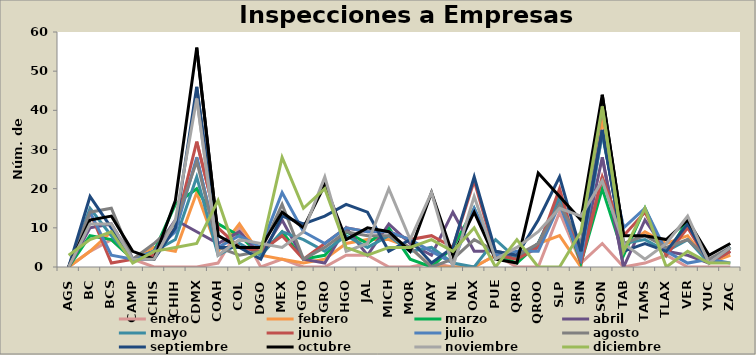
| Category | enero | febrero | marzo | abril | mayo | junio | julio | agosto | septiembre | octubre | noviembre | diciembre |
|---|---|---|---|---|---|---|---|---|---|---|---|---|
| AGS | 0 | 0 | 0 | 0 | 0 | 0 | 0 | 0 | 0 | 0 | 0 | 3 |
| BC | 4 | 4 | 8 | 10 | 15 | 14 | 14 | 14 | 18 | 12 | 11 | 7 |
| BCS | 7 | 9 | 7 | 11 | 8 | 1 | 3 | 15 | 10 | 13 | 11 | 9 |
| CAMP | 2 | 2 | 2 | 2 | 2 | 2 | 2 | 2 | 2 | 4 | 2 | 1 |
| CHIS | 0 | 5 | 4 | 4 | 4 | 3 | 4 | 6 | 2 | 2 | 2 | 4 |
| CHIH | 0 | 4 | 16 | 12 | 7 | 10 | 9 | 11 | 10 | 17 | 12 | 5 |
| CDMX | 0 | 19 | 20 | 9 | 23 | 32 | 28 | 27 | 46 | 56 | 43 | 6 |
| COAH | 1 | 4 | 11 | 6 | 3 | 10 | 5 | 5 | 5 | 8 | 3 | 17 |
| COL | 10 | 11 | 8 | 9 | 6 | 5 | 8 | 3 | 5 | 5 | 7 | 1 |
| DGO | 0 | 3 | 3 | 3 | 3 | 4 | 5 | 4 | 2 | 5 | 6 | 4 |
| MEX | 2 | 2 | 9 | 12 | 9 | 8 | 19 | 16 | 13 | 14 | 5 | 28 |
| GTO | 0 | 1 | 2 | 2 | 7 | 2 | 9 | 2 | 11 | 10 | 9 | 15 |
| GRO | 0 | 2 | 3 | 1 | 4 | 6 | 6 | 5 | 13 | 21 | 23 | 20 |
| HGO | 3 | 6 | 9 | 10 | 8 | 10 | 10 | 9 | 16 | 7 | 4 | 5 |
| JAL | 3 | 7 | 6 | 3 | 5 | 9 | 9 | 8 | 14 | 10 | 6 | 3 |
| MICH | 0 | 7 | 10 | 11 | 8 | 9 | 9 | 8 | 4 | 9 | 20 | 5 |
| MOR | 0 | 5 | 2 | 6 | 4 | 7 | 7 | 5 | 7 | 4 | 7 | 5 |
| NAY | 1 | 0 | 0 | 3 | 5 | 8 | 4 | 0 | 1 | 19 | 19 | 7 |
| NL | 0 | 0 | 5 | 14 | 1 | 5 | 1 | 2 | 5 | 3 | 0 | 4 |
| OAX | 0 | 0 | 15 | 4 | 0 | 22 | 15 | 7 | 23 | 14 | 18 | 10 |
| PUE | 3 | 3 | 3 | 4 | 7 | 3 | 3 | 4 | 4 | 2 | 2 | 0 |
| QRO | 0 | 2 | 1 | 2 | 2 | 2 | 4 | 3 | 3 | 1 | 5 | 7 |
| QROO | 0 | 6 | 6 | 6 | 6 | 5 | 4 | 6 | 12 | 24 | 9 | 0 |
| SLP | 14 | 8 | 17 | 17 | 18 | 20 | 16 | 16 | 23 | 18 | 15 | 0 |
| SIN | 1 | 0 | 1 | 2 | 3 | 1 | 2 | 6 | 4 | 12 | 13 | 9 |
| SON | 6 | 38 | 20 | 28 | 34 | 23 | 35 | 41 | 35 | 44 | 22 | 41 |
| TAB | 0 | 5 | 3 | 0 | 6 | 8 | 10 | 6 | 4 | 8 | 6 | 4 |
| TAMS | 1 | 9 | 15 | 12 | 7 | 14 | 15 | 8 | 6 | 8 | 2 | 15 |
| TLAX | 3 | 6 | 3 | 4 | 4 | 3 | 4 | 5 | 4 | 7 | 6 | 0 |
| VER | 0 | 8 | 12 | 3 | 7 | 10 | 1 | 7 | 11 | 12 | 13 | 4 |
| YUC | 0 | 1 | 1 | 1 | 1 | 1 | 2 | 2 | 1 | 3 | 1 | 1 |
| ZAC | 0 | 3 | 5 | 4 | 5 | 4 | 1 | 5 | 5 | 6 | 5 | 1 |